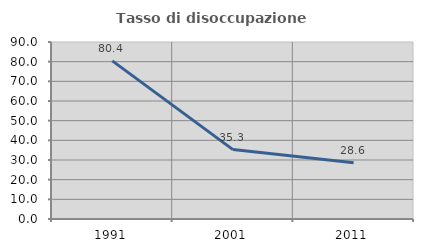
| Category | Tasso di disoccupazione giovanile  |
|---|---|
| 1991.0 | 80.392 |
| 2001.0 | 35.294 |
| 2011.0 | 28.571 |